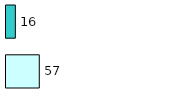
| Category | Series 0 | Series 1 |
|---|---|---|
| 0 | 57 | 16 |